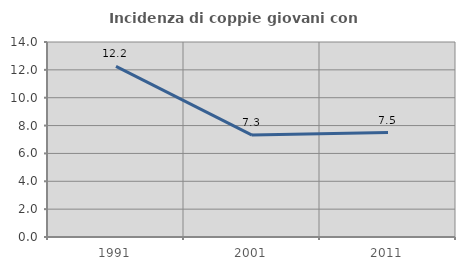
| Category | Incidenza di coppie giovani con figli |
|---|---|
| 1991.0 | 12.245 |
| 2001.0 | 7.317 |
| 2011.0 | 7.5 |